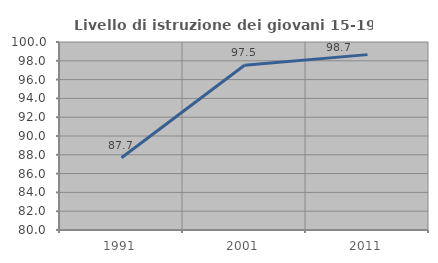
| Category | Livello di istruzione dei giovani 15-19 anni |
|---|---|
| 1991.0 | 87.681 |
| 2001.0 | 97.526 |
| 2011.0 | 98.657 |